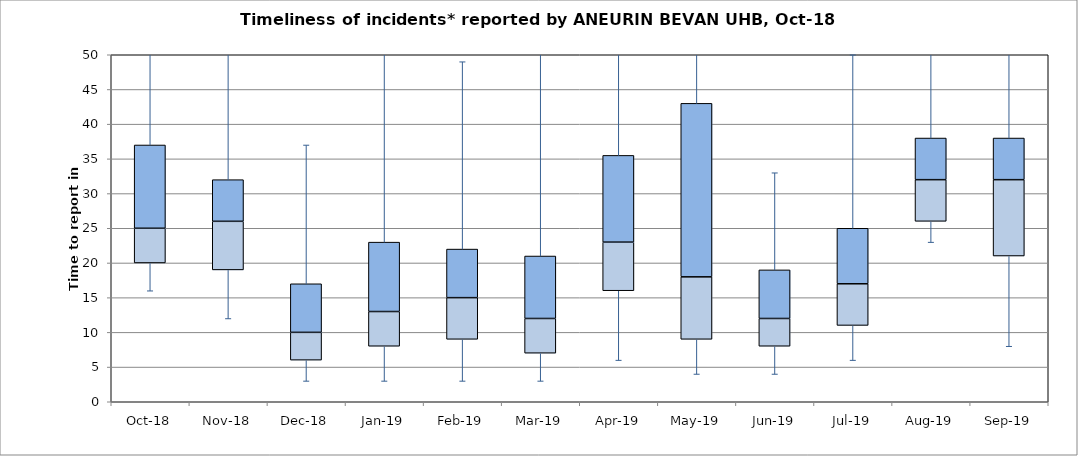
| Category | Series 0 | Series 1 | Series 2 |
|---|---|---|---|
| Oct-18 | 20 | 5 | 12 |
| Nov-18 | 19 | 7 | 6 |
| Dec-18 | 6 | 4 | 7 |
| Jan-19 | 8 | 5 | 10 |
| Feb-19 | 9 | 6 | 7 |
| Mar-19 | 7 | 5 | 9 |
| Apr-19 | 16 | 7 | 12.5 |
| May-19 | 9 | 9 | 25 |
| Jun-19 | 8 | 4 | 7 |
| Jul-19 | 11 | 6 | 8 |
| Aug-19 | 26 | 6 | 6 |
| Sep-19 | 21 | 11 | 6 |